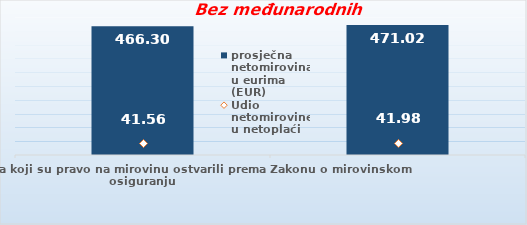
| Category | prosječna netomirovina u eurima (EUR) |
|---|---|
| Korisnici mirovina koji su pravo na mirovinu ostvarili prema Zakonu o mirovinskom osiguranju  | 466.3 |
| Korisnici koji su pravo na mirovinu PRVI PUT ostvarili u 2023. godini prema Zakonu o mirovinskom osiguranju - NOVI KORISNICI | 471.018 |